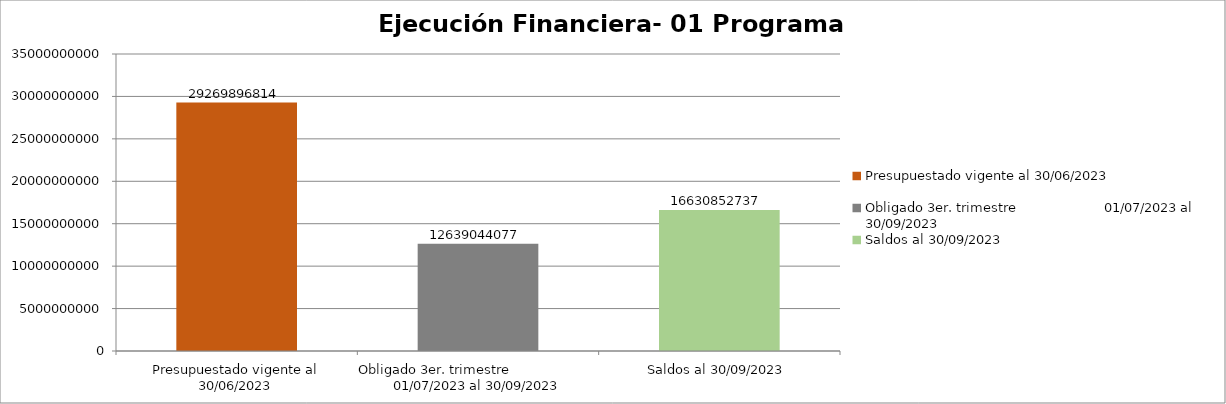
| Category | Presupuestado vigente al 30/06/2023 Obligado 3er. trimestre                      01/07/2023 al 30/09/2023 Saldos al 30/09/2023 |
|---|---|
| Presupuestado vigente al 30/06/2023 | 29269896814 |
| Obligado 3er. trimestre                      01/07/2023 al 30/09/2023 | 12639044077 |
| Saldos al 30/09/2023 | 16630852737 |